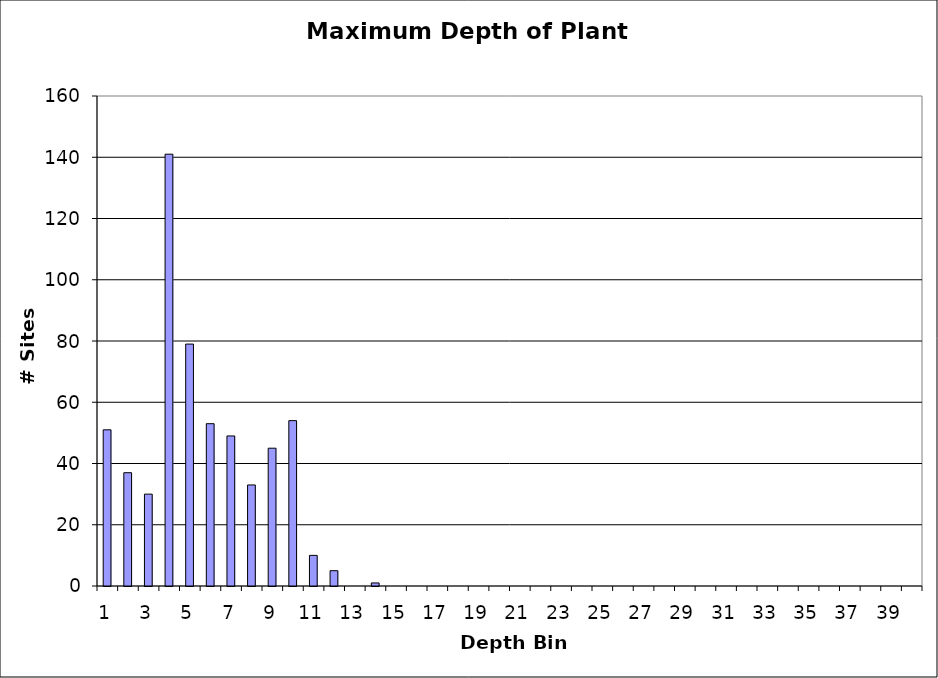
| Category | Series 0 |
|---|---|
| 1.0 | 51 |
| 2.0 | 37 |
| 3.0 | 30 |
| 4.0 | 141 |
| 5.0 | 79 |
| 6.0 | 53 |
| 7.0 | 49 |
| 8.0 | 33 |
| 9.0 | 45 |
| 10.0 | 54 |
| 11.0 | 10 |
| 12.0 | 5 |
| 13.0 | 0 |
| 14.0 | 1 |
| 15.0 | 0 |
| 16.0 | 0 |
| 17.0 | 0 |
| 18.0 | 0 |
| 19.0 | 0 |
| 20.0 | 0 |
| 21.0 | 0 |
| 22.0 | 0 |
| 23.0 | 0 |
| 24.0 | 0 |
| 25.0 | 0 |
| 26.0 | 0 |
| 27.0 | 0 |
| 28.0 | 0 |
| 29.0 | 0 |
| 30.0 | 0 |
| 31.0 | 0 |
| 32.0 | 0 |
| 33.0 | 0 |
| 34.0 | 0 |
| 35.0 | 0 |
| 36.0 | 0 |
| 37.0 | 0 |
| 38.0 | 0 |
| 39.0 | 0 |
| 40.0 | 0 |